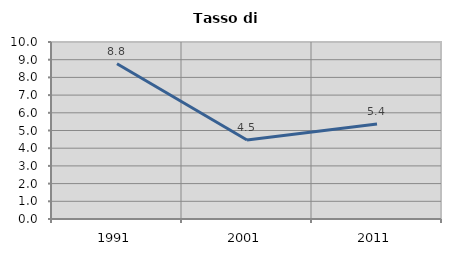
| Category | Tasso di disoccupazione   |
|---|---|
| 1991.0 | 8.773 |
| 2001.0 | 4.467 |
| 2011.0 | 5.369 |